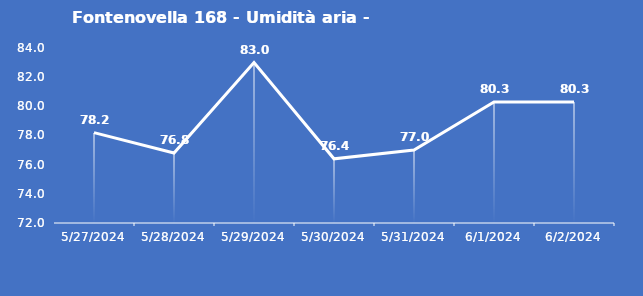
| Category | Fontenovella 168 - Umidità aria - Grezzo (%) |
|---|---|
| 5/27/24 | 78.2 |
| 5/28/24 | 76.8 |
| 5/29/24 | 83 |
| 5/30/24 | 76.4 |
| 5/31/24 | 77 |
| 6/1/24 | 80.3 |
| 6/2/24 | 80.3 |